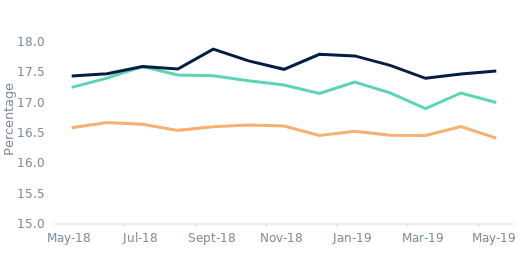
| Category | First-time
buyers | Homemovers | Remortgagors |
|---|---|---|---|
| 2018-05-01 | 17.251 | 17.44 | 16.586 |
| 2018-06-01 | 17.405 | 17.476 | 16.672 |
| 2018-07-01 | 17.595 | 17.596 | 16.644 |
| 2018-08-01 | 17.456 | 17.554 | 16.543 |
| 2018-09-01 | 17.444 | 17.883 | 16.604 |
| 2018-10-01 | 17.36 | 17.689 | 16.63 |
| 2018-11-01 | 17.29 | 17.55 | 16.616 |
| 2018-12-01 | 17.152 | 17.798 | 16.458 |
| 2019-01-01 | 17.341 | 17.771 | 16.529 |
| 2019-02-01 | 17.162 | 17.614 | 16.461 |
| 2019-03-01 | 16.903 | 17.402 | 16.458 |
| 2019-04-01 | 17.159 | 17.472 | 16.606 |
| 2019-05-01 | 17.002 | 17.523 | 16.416 |